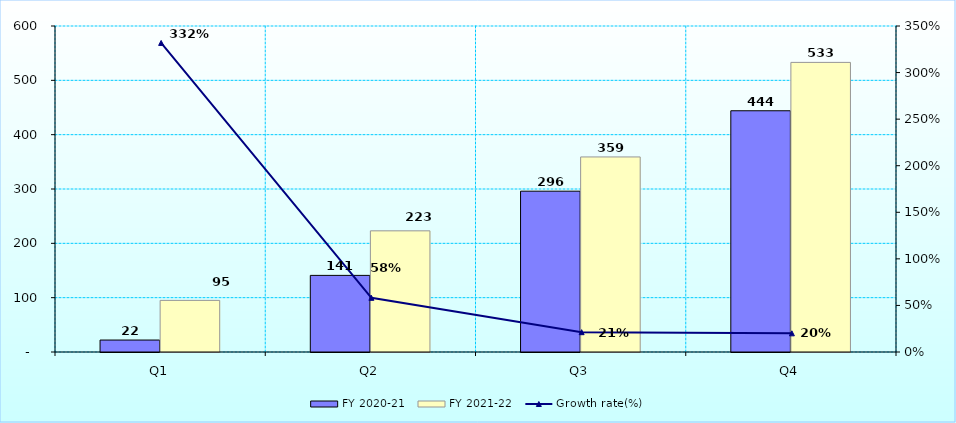
| Category | FY 2020-21 | FY 2021-22 |
|---|---|---|
| Q1 | 22 | 95 |
| Q2 | 141 | 223 |
| Q3 | 296 | 359 |
| Q4 | 444 | 533 |